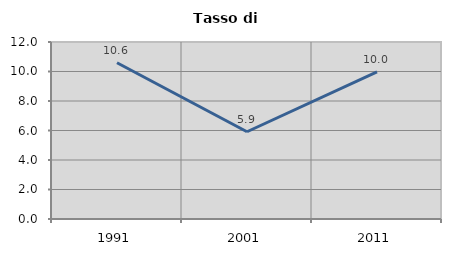
| Category | Tasso di disoccupazione   |
|---|---|
| 1991.0 | 10.596 |
| 2001.0 | 5.915 |
| 2011.0 | 9.974 |